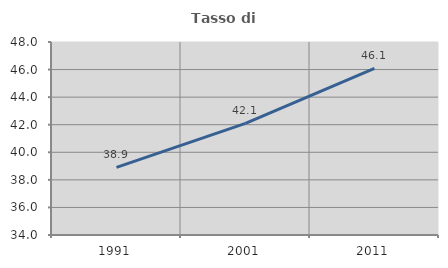
| Category | Tasso di occupazione   |
|---|---|
| 1991.0 | 38.91 |
| 2001.0 | 42.094 |
| 2011.0 | 46.09 |